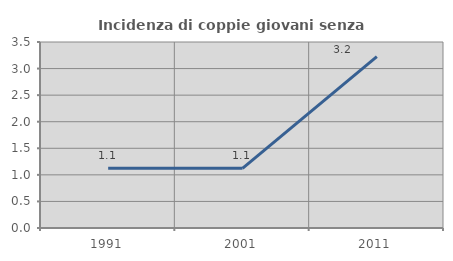
| Category | Incidenza di coppie giovani senza figli |
|---|---|
| 1991.0 | 1.124 |
| 2001.0 | 1.124 |
| 2011.0 | 3.226 |